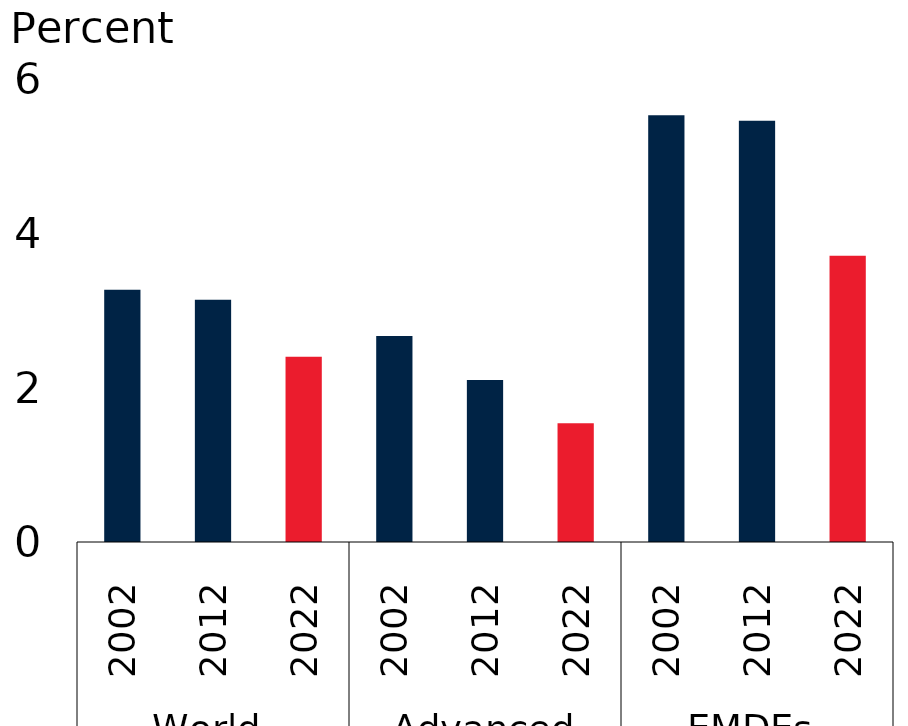
| Category | Ten-year-ahead growth forecasts |
|---|---|
| 0 | 3.27 |
| 1 | 3.14 |
| 2 | 2.4 |
| 3 | 2.67 |
| 4 | 2.1 |
| 5 | 1.54 |
| 6 | 5.53 |
| 7 | 5.46 |
| 8 | 3.71 |